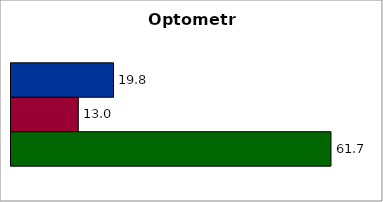
| Category | 50 states and D.C. | SREB states | State |
|---|---|---|---|
| 0 | 19.765 | 12.977 | 61.702 |